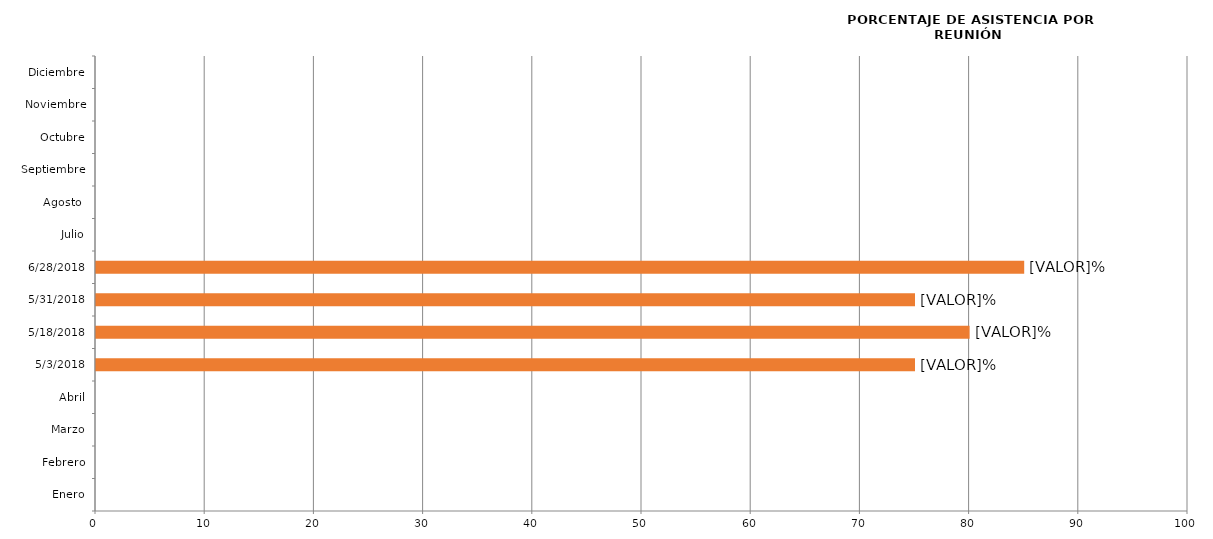
| Category | Series 0 |
|---|---|
| Enero | 0 |
| Febrero | 0 |
| Marzo | 0 |
| Abril | 0 |
| 03/05/2018 | 75 |
| 18/05/2018 | 80 |
| 31/05/2018 | 75 |
| 28/06/2018 | 85 |
| Julio | 0 |
| Agosto  | 0 |
| Septiembre | 0 |
| Octubre | 0 |
| Noviembre | 0 |
| Diciembre | 0 |